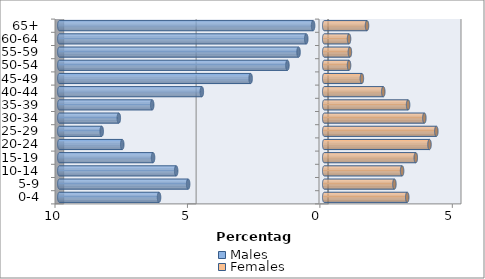
| Category | Males | Females |
|---|---|---|
| 0-4 | -6.236 | 3.134 |
| 5-9 | -5.137 | 2.649 |
| 10-14 | -5.59 | 2.94 |
| 15-19 | -6.462 | 3.457 |
| 20-24 | -7.625 | 3.974 |
| 25-29 | -8.401 | 4.233 |
| 30-34 | -7.754 | 3.78 |
| 35-39 | -6.494 | 3.166 |
| 40-44 | -4.62 | 2.229 |
| 45-49 | -2.779 | 1.422 |
| 50-54 | -1.389 | 0.937 |
| 55-59 | -0.969 | 0.969 |
| 60-64 | -0.679 | 0.937 |
| 65+ | -0.42 | 1.616 |